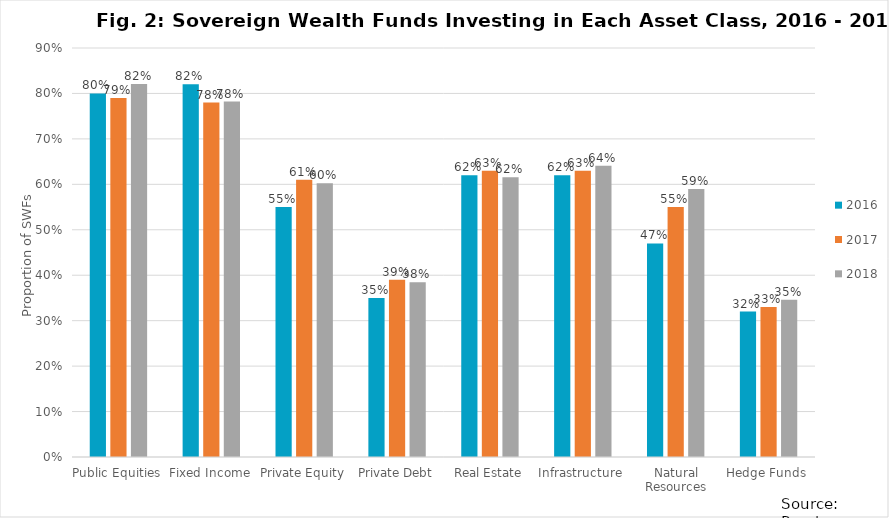
| Category | 2016 | 2017 | 2018 |
|---|---|---|---|
| Public Equities | 0.8 | 0.79 | 0.821 |
| Fixed Income | 0.82 | 0.78 | 0.782 |
| Private Equity | 0.55 | 0.61 | 0.603 |
| Private Debt | 0.35 | 0.39 | 0.385 |
| Real Estate | 0.62 | 0.63 | 0.615 |
| Infrastructure  | 0.62 | 0.63 | 0.641 |
| Natural Resources | 0.47 | 0.55 | 0.59 |
| Hedge Funds  | 0.32 | 0.33 | 0.346 |